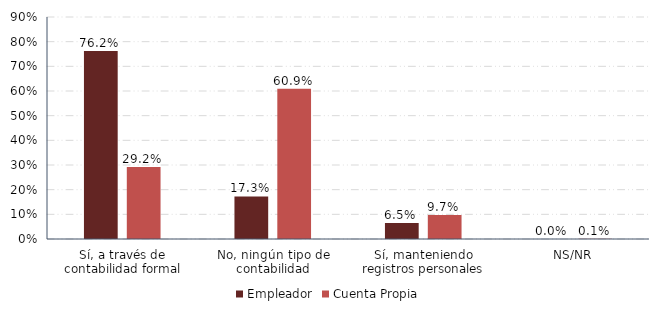
| Category | Empleador | Cuenta Propia |
|---|---|---|
| Sí, a través de contabilidad formal | 0.762 | 0.292 |
| No, ningún tipo de contabilidad | 0.173 | 0.609 |
| Sí, manteniendo registros personales | 0.065 | 0.097 |
| NS/NR | 0 | 0.001 |